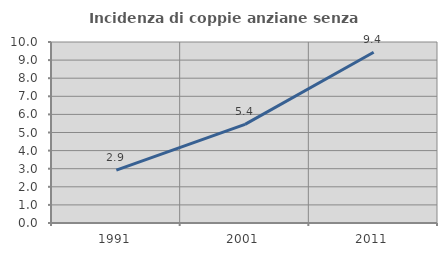
| Category | Incidenza di coppie anziane senza figli  |
|---|---|
| 1991.0 | 2.918 |
| 2001.0 | 5.447 |
| 2011.0 | 9.431 |